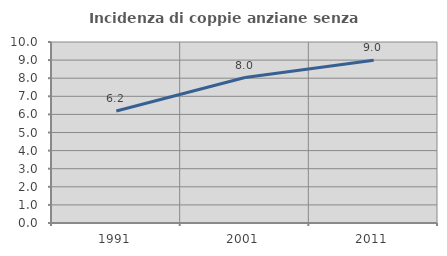
| Category | Incidenza di coppie anziane senza figli  |
|---|---|
| 1991.0 | 6.188 |
| 2001.0 | 8.039 |
| 2011.0 | 8.986 |